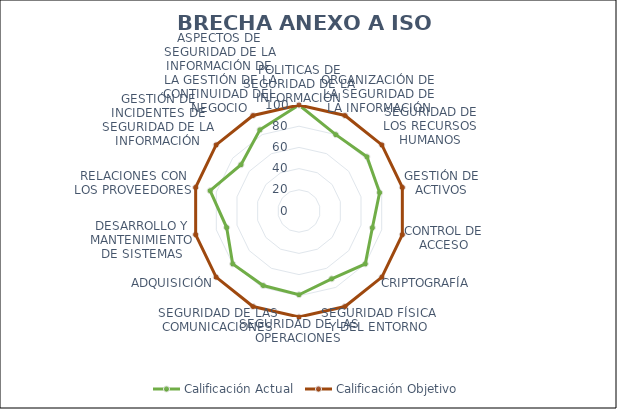
| Category | Calificación Actual | Calificación Objetivo |
|---|---|---|
| 0 | 100 | 100 |
| 1 | 80 | 100 |
| 2 | 82 | 100 |
| 3 | 78 | 100 |
| 4 | 71 | 100 |
| 5 | 80 | 100 |
| 6 | 71 | 100 |
| 7 | 79 | 100 |
| 8 | 78 | 100 |
| 9 | 80 | 100 |
| 10 | 70 | 100 |
| 11 | 86 | 100 |
| 12 | 70 | 100 |
| 13 | 85 | 100 |